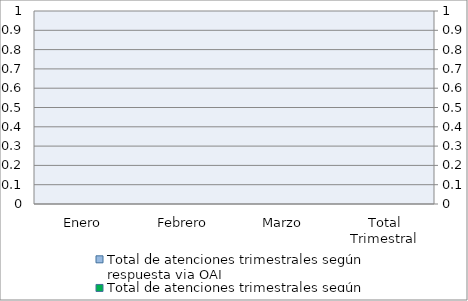
| Category | Total de atenciones trimestrales según respuesta via OAI | Series 2 | Series 4 |
|---|---|---|---|
| Enero | 0 |  |  |
| Febrero | 0 |  |  |
| Marzo | 0 |  |  |
| Total Trimestral | 0 |  |  |